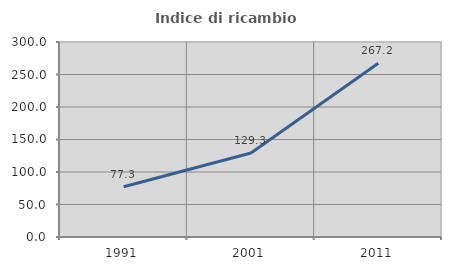
| Category | Indice di ricambio occupazionale  |
|---|---|
| 1991.0 | 77.301 |
| 2001.0 | 129.263 |
| 2011.0 | 267.153 |